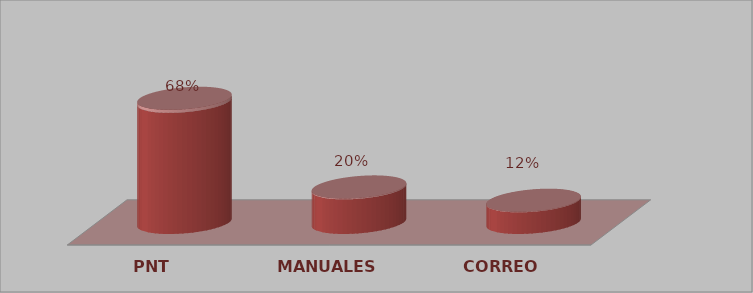
| Category | Series 0 | Series 1 |
|---|---|---|
| PNT | 28 | 0.683 |
| MANUALES | 8 | 0.195 |
| CORREO | 5 | 0.122 |